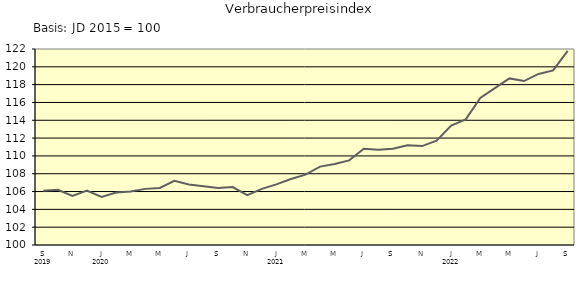
| Category | Series 0 |
|---|---|
| 0 | 106.1 |
| 1 | 106.2 |
| 2 | 105.5 |
| 3 | 106.1 |
| 4 | 105.4 |
| 5 | 105.9 |
| 6 | 106 |
| 7 | 106.3 |
| 8 | 106.4 |
| 9 | 107.2 |
| 10 | 106.8 |
| 11 | 106.6 |
| 12 | 106.4 |
| 13 | 106.5 |
| 14 | 105.6 |
| 15 | 106.3 |
| 16 | 106.8 |
| 17 | 107.4 |
| 18 | 107.9 |
| 19 | 108.8 |
| 20 | 109.1 |
| 21 | 109.5 |
| 22 | 110.8 |
| 23 | 110.7 |
| 24 | 110.8 |
| 25 | 111.2 |
| 26 | 111.1 |
| 27 | 111.7 |
| 28 | 113.4 |
| 29 | 114.1 |
| 30 | 116.5 |
| 31 | 117.6 |
| 32 | 118.7 |
| 33 | 118.4 |
| 34 | 119.2 |
| 35 | 119.6 |
| 36 | 121.8 |